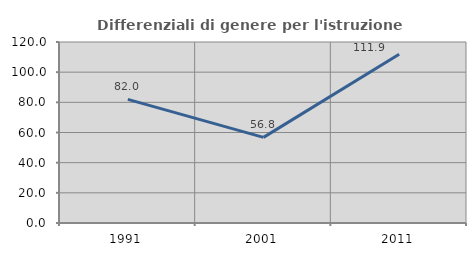
| Category | Differenziali di genere per l'istruzione superiore |
|---|---|
| 1991.0 | 81.995 |
| 2001.0 | 56.761 |
| 2011.0 | 111.925 |